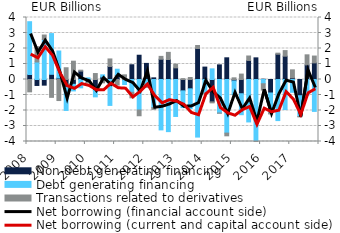
| Category | Non-debt generating financing | Debt generating financing | Transactions related to derivatives |
|---|---|---|---|
| 2008.0 | 0.322 | 3.407 | -0.797 |
| 2008.0 | -0.385 | 1.131 | 0.986 |
| 2008.0 | -0.364 | 2.578 | 0.292 |
| 2008.0 | 0.334 | 2.628 | -1.152 |
| 2009.0 | 0.096 | 1.742 | -1.358 |
| 2009.0 | -0.495 | -1.502 | 0.758 |
| 2009.0 | -0.31 | -0.426 | 1.181 |
| 2009.0 | 0.54 | -0.537 | 0.06 |
| 2010.0 | -0.188 | 0.108 | -0.028 |
| 2010.0 | -0.709 | -0.411 | 0.384 |
| 2010.0 | 0.167 | 0.134 | -0.216 |
| 2010.0 | 0.841 | -1.672 | 0.485 |
| 2011.0 | 0.279 | 0.384 | -0.362 |
| 2011.0 | -0.045 | -0.279 | 0.301 |
| 2011.0 | 0.951 | -0.827 | -0.355 |
| 2011.0 | 1.566 | -1.967 | -0.372 |
| 2012.0 | 1.038 | -0.282 | -0.228 |
| 2012.0 | 0.107 | -1.816 | -0.112 |
| 2012.0 | 1.307 | -3.251 | 0.185 |
| 2012.0 | 1.29 | -3.363 | 0.461 |
| 2013.0 | 0.752 | -2.385 | 0.238 |
| 2013.0 | -0.734 | -1.079 | 0.057 |
| 2013.0 | -0.601 | -1.268 | 0.129 |
| 2013.0 | 2.002 | -3.715 | 0.193 |
| 2014.0 | 0.8 | -0.873 | -0.015 |
| 2014.0 | -1.445 | 0.687 | -0.062 |
| 2014.0 | 0.944 | -2.164 | -0.012 |
| 2014.0 | 1.399 | -3.458 | -0.175 |
| 2015.0 | -0.094 | -0.877 | 0.108 |
| 2015.0 | -0.918 | -1.353 | 0.349 |
| 2015.0 | 1.228 | -2.738 | 0.289 |
| 2015.0 | 1.396 | -4.058 | -0.059 |
| 2016.0 | 0.018 | -0.276 | -0.406 |
| 2016.0 | -0.87 | -1.275 | -0.078 |
| 2016.0 | 1.629 | -2.651 | 0.07 |
| 2016.0 | 1.504 | -1.939 | 0.361 |
| 2017.0 | 0.109 | -0.825 | 0.515 |
| 2017.0 | -1.045 | -1.34 | -0.027 |
| 2017.0 | 0.943 | -1.011 | 0.649 |
| 2017.0 | 1.073 | -2.059 | 0.44 |